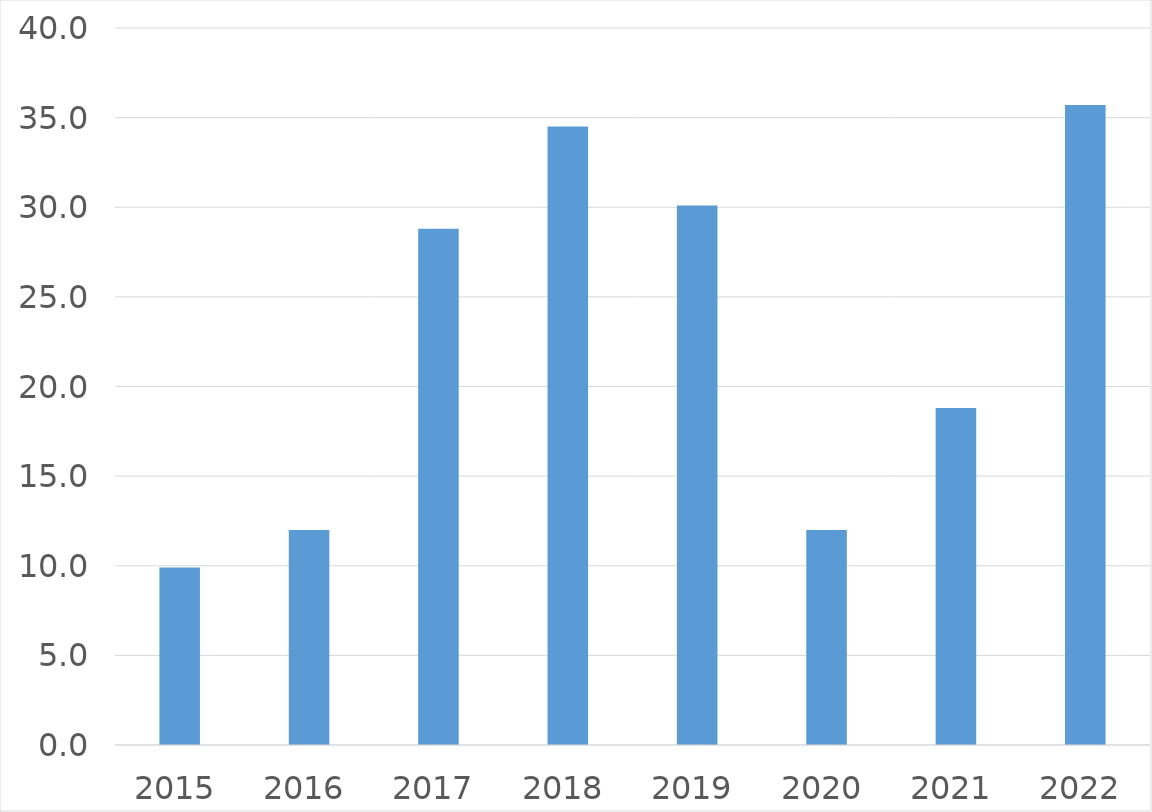
| Category | Series 0 |
|---|---|
| 2015 | 9.9 |
| 2016 | 12 |
| 2017 | 28.8 |
| 2018 | 34.5 |
| 2019 | 30.1 |
| 2020 | 12 |
| 2021 | 18.8 |
| 2022 | 35.7 |